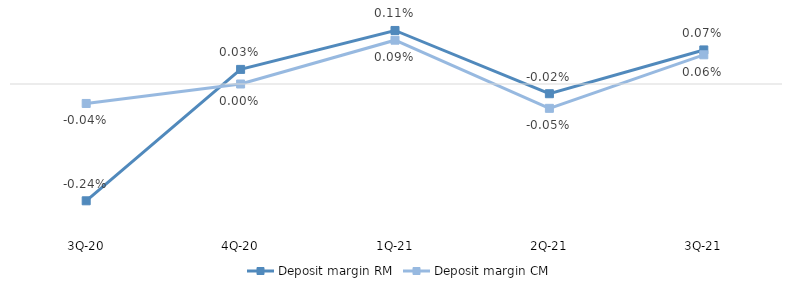
| Category | Deposit margin RM | Deposit margin CM |
|---|---|---|
| 3Q-21 | 0.001 | 0.001 |
| 2Q-21 | 0 | 0 |
| 1Q-21 | 0.001 | 0.001 |
| 4Q-20 | 0 | 0 |
| 3Q-20 | -0.002 | 0 |